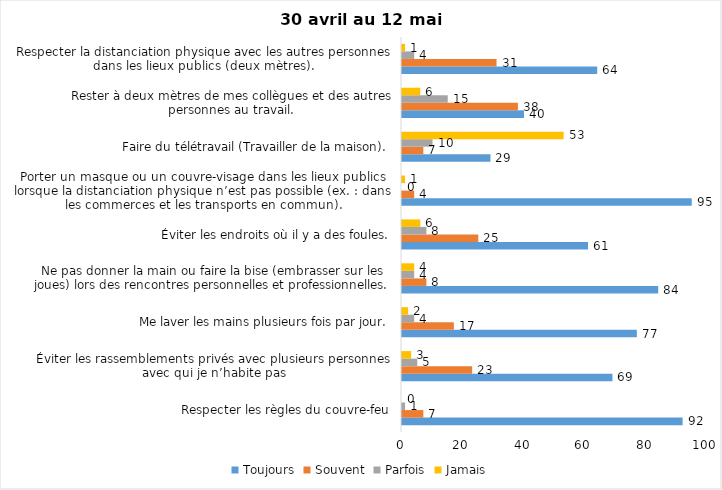
| Category | Toujours | Souvent | Parfois | Jamais |
|---|---|---|---|---|
| Respecter les règles du couvre-feu | 92 | 7 | 1 | 0 |
| Éviter les rassemblements privés avec plusieurs personnes avec qui je n’habite pas | 69 | 23 | 5 | 3 |
| Me laver les mains plusieurs fois par jour. | 77 | 17 | 4 | 2 |
| Ne pas donner la main ou faire la bise (embrasser sur les joues) lors des rencontres personnelles et professionnelles. | 84 | 8 | 4 | 4 |
| Éviter les endroits où il y a des foules. | 61 | 25 | 8 | 6 |
| Porter un masque ou un couvre-visage dans les lieux publics lorsque la distanciation physique n’est pas possible (ex. : dans les commerces et les transports en commun). | 95 | 4 | 0 | 1 |
| Faire du télétravail (Travailler de la maison). | 29 | 7 | 10 | 53 |
| Rester à deux mètres de mes collègues et des autres personnes au travail. | 40 | 38 | 15 | 6 |
| Respecter la distanciation physique avec les autres personnes dans les lieux publics (deux mètres). | 64 | 31 | 4 | 1 |